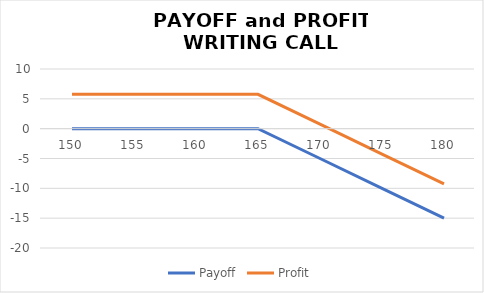
| Category | Payoff | Profit |
|---|---|---|
| 150.0 | 0 | 5.75 |
| 155.0 | 0 | 5.75 |
| 160.0 | 0 | 5.75 |
| 165.0 | 0 | 5.75 |
| 170.0 | -5 | 0.75 |
| 175.0 | -10 | -4.25 |
| 180.0 | -15 | -9.25 |